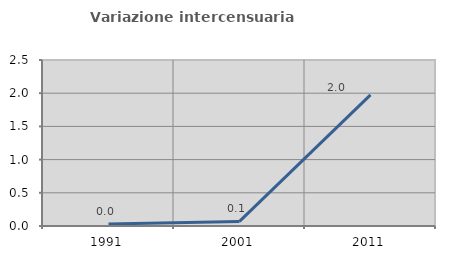
| Category | Variazione intercensuaria annua |
|---|---|
| 1991.0 | 0.029 |
| 2001.0 | 0.069 |
| 2011.0 | 1.975 |